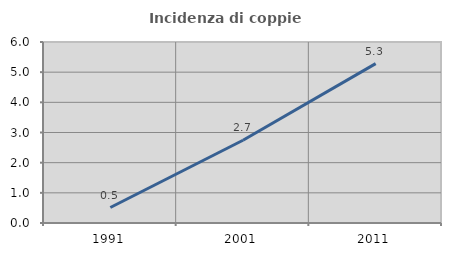
| Category | Incidenza di coppie miste |
|---|---|
| 1991.0 | 0.513 |
| 2001.0 | 2.744 |
| 2011.0 | 5.285 |